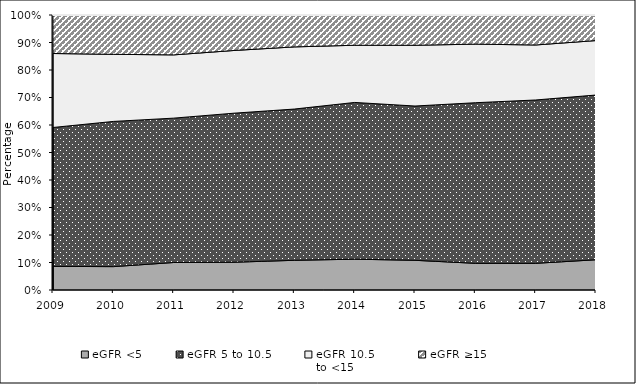
| Category | eGFR <5 | eGFR 5 to 10.5 | eGFR 10.5 
to <15 | eGFR ≥15 |
|---|---|---|---|---|
| 2009.0 | 8.6 | 50.5 | 26.9 | 14 |
| 2010.0 | 8.5 | 52.8 | 24.4 | 14.3 |
| 2011.0 | 10 | 52.5 | 23 | 14.5 |
| 2012.0 | 10.1 | 54.2 | 22.8 | 12.8 |
| 2013.0 | 10.8 | 55 | 22.6 | 11.6 |
| 2014.0 | 11.2 | 57 | 20.8 | 11 |
| 2015.0 | 10.8 | 56.1 | 22.1 | 11 |
| 2016.0 | 9.7 | 58.4 | 21.3 | 10.6 |
| 2017.0 | 9.7 | 59.4 | 20 | 10.8 |
| 2018.0 | 11 | 59.9 | 19.8 | 9.4 |